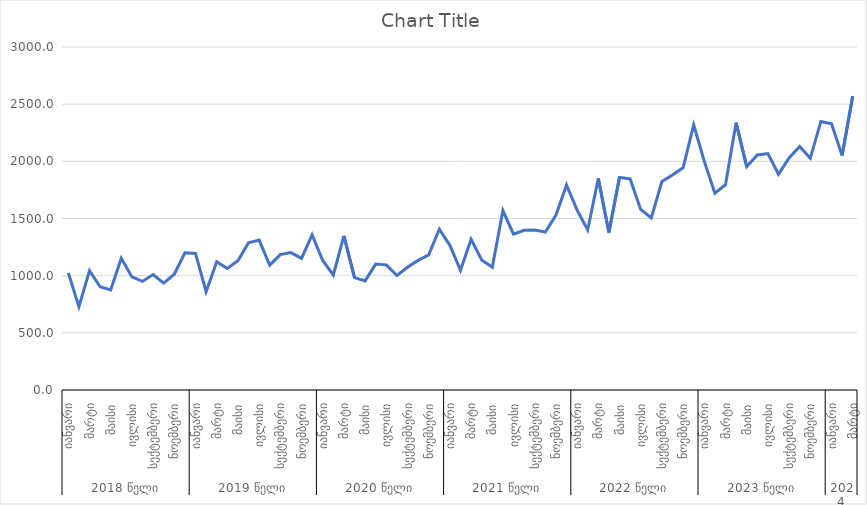
| Category | Series 0 |
|---|---|
| 0 | 1024 |
| 1 | 728.5 |
| 2 | 1042.8 |
| 3 | 902.6 |
| 4 | 874.8 |
| 5 | 1152.9 |
| 6 | 989.5 |
| 7 | 949.7 |
| 8 | 1009.4 |
| 9 | 934.7 |
| 10 | 1013 |
| 11 | 1200.2 |
| 12 | 1193.9 |
| 13 | 860.1 |
| 14 | 1121.9 |
| 15 | 1063 |
| 16 | 1130.4 |
| 17 | 1287.4 |
| 18 | 1310.9 |
| 19 | 1092.1 |
| 20 | 1184.2 |
| 21 | 1202.1 |
| 22 | 1151.6 |
| 23 | 1357.2 |
| 24 | 1132.8 |
| 25 | 1004.3 |
| 26 | 1348.6 |
| 27 | 982.4 |
| 28 | 954.4 |
| 29 | 1101.3 |
| 30 | 1094.6 |
| 31 | 1001.9 |
| 32 | 1073.6 |
| 33 | 1133.8 |
| 34 | 1181.4 |
| 35 | 1407.1 |
| 36 | 1265.4 |
| 37 | 1047.7 |
| 38 | 1317.4 |
| 39 | 1137.6 |
| 40 | 1073.6 |
| 41 | 1569.7 |
| 42 | 1364.1 |
| 43 | 1397.3 |
| 44 | 1399 |
| 45 | 1381.1 |
| 46 | 1528 |
| 47 | 1792.7 |
| 48 | 1573.2 |
| 49 | 1399.6 |
| 50 | 1849.6 |
| 51 | 1377.6 |
| 52 | 1860.1 |
| 53 | 1845.8 |
| 54 | 1579.4 |
| 55 | 1505.7 |
| 56 | 1823.4 |
| 57 | 1879.9 |
| 58 | 1943.8 |
| 59 | 2318.7 |
| 60 | 1999.6 |
| 61 | 1720.8 |
| 62 | 1795.7 |
| 63 | 2337.8 |
| 64 | 1953.3 |
| 65 | 2056.3 |
| 66 | 2067.5 |
| 67 | 1887.5 |
| 68 | 2028.9 |
| 69 | 2129.1 |
| 70 | 2026.1 |
| 71 | 2348.9 |
| 72 | 2329.2 |
| 73 | 2051.7 |
| 74 | 2569.8 |